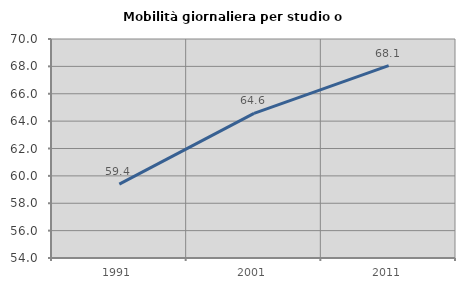
| Category | Mobilità giornaliera per studio o lavoro |
|---|---|
| 1991.0 | 59.395 |
| 2001.0 | 64.571 |
| 2011.0 | 68.056 |